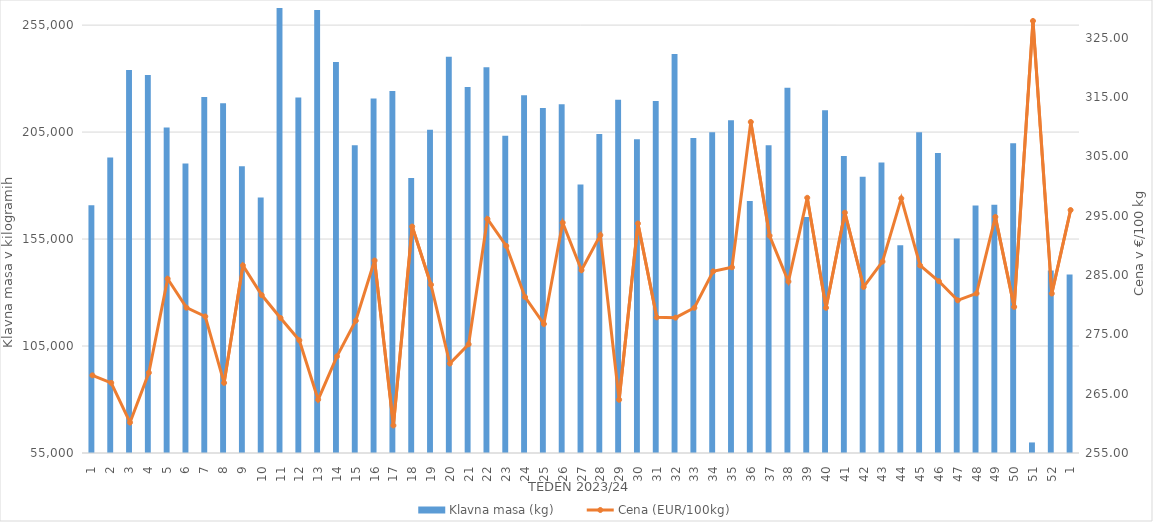
| Category | Klavna masa (kg) |
|---|---|
| 1.0 | 170843 |
| 2.0 | 193093 |
| 3.0 | 234042 |
| 4.0 | 231737 |
| 5.0 | 207136 |
| 6.0 | 190311 |
| 7.0 | 221366 |
| 8.0 | 218470 |
| 9.0 | 189006 |
| 10.0 | 174425 |
| 11.0 | 265476 |
| 12.0 | 221171 |
| 13.0 | 262102 |
| 14.0 | 237813 |
| 15.0 | 198828 |
| 16.0 | 220686 |
| 17.0 | 224192 |
| 18.0 | 183508 |
| 19.0 | 206133 |
| 20.0 | 240223 |
| 21.0 | 226050 |
| 22.0 | 235273 |
| 23.0 | 203306 |
| 24.0 | 222178 |
| 25.0 | 216259 |
| 26.0 | 218064 |
| 27.0 | 180556 |
| 28.0 | 204078 |
| 29.0 | 220162 |
| 30.0 | 201649 |
| 31.0 | 219538 |
| 32.0 | 241549 |
| 33.0 | 202261 |
| 34.0 | 204903 |
| 35.0 | 210575 |
| 36.0 | 172745 |
| 37.0 | 198877 |
| 38.0 | 225730 |
| 39.0 | 165273 |
| 40.0 | 215175 |
| 41.0 | 193769 |
| 42.0 | 184122 |
| 43.0 | 190834 |
| 44.0 | 152119 |
| 45.0 | 204974 |
| 46.0 | 195179 |
| 47.0 | 155300 |
| 48.0 | 170687 |
| 49.0 | 171040 |
| 50.0 | 199802 |
| 51.0 | 59936 |
| 52.0 | 140361 |
| 1.0 | 138450 |